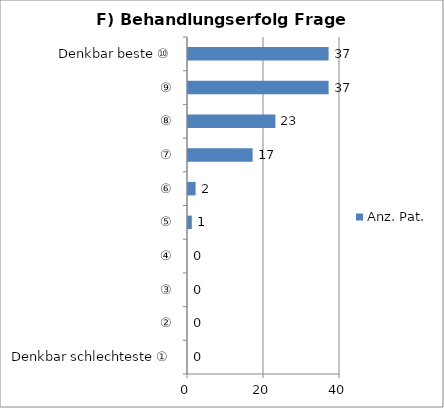
| Category | Anz. Pat. |
|---|---|
| Denkbar schlechteste ①  | 0 |
| ② | 0 |
| ③ | 0 |
| ④ | 0 |
| ⑤ | 1 |
| ⑥ | 2 |
| ⑦ | 17 |
| ⑧ | 23 |
| ⑨ | 37 |
| Denkbar beste ⑩ | 37 |